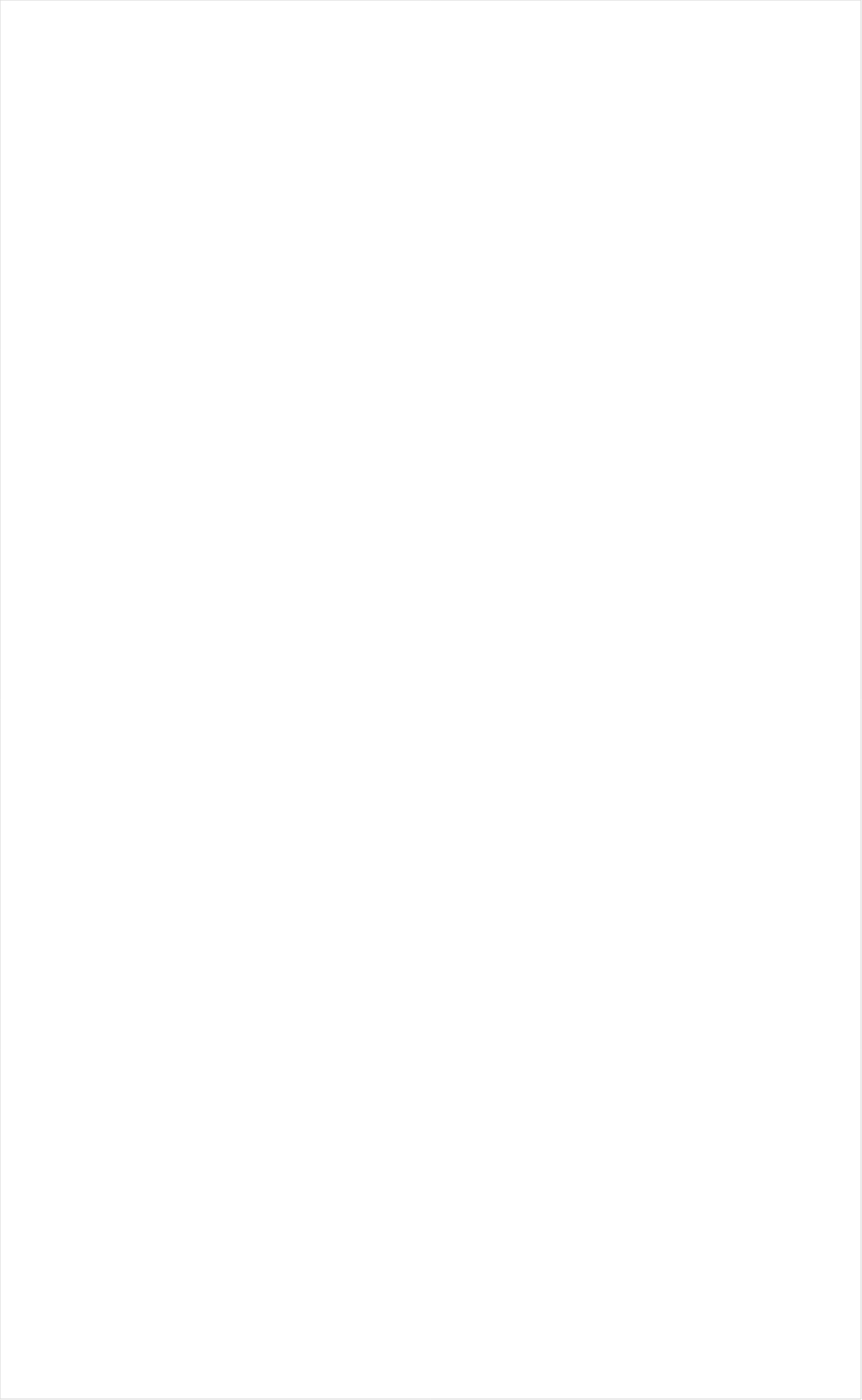
| Category | Total |
|---|---|
| PAC-12 Network | -0.396 |
| RFD TV | -0.291 |
| MyNetworkTV | -0.195 |
| Fox Business | -0.189 |
| Hallmark Movies & Mysteries | -0.188 |
| PBS | -0.183 |
| INSP | -0.171 |
| Smithsonian | -0.165 |
| Tennis Channel | -0.152 |
| MSNBC | -0.149 |
| Hallmark | -0.123 |
| Science Channel | -0.118 |
| Fox News | -0.117 |
| CBS | -0.114 |
| CBS Sports | -0.113 |
| Bloomberg HD | -0.111 |
| History Channel | -0.105 |
| Outdoor Channel | -0.102 |
| Reelz Channel | -0.101 |
| American Heroes Channel | -0.1 |
| DIY | -0.095 |
| Destination America | -0.095 |
| FXDEP | -0.093 |
| National Geographic Wild | -0.093 |
| BBC America | -0.093 |
| Weather Channel | -0.088 |
| CW | -0.085 |
| Olympic Channel | -0.083 |
| SundanceTV | -0.083 |
| ABC | -0.082 |
| FYI | -0.076 |
| NBC | -0.076 |
| HGTV | -0.072 |
| Game Show | -0.069 |
| Fox Sports 1 | -0.069 |
| TV LAND | -0.067 |
| Great American Country | -0.066 |
| Motor Trend Network | -0.066 |
| Cooking Channel | -0.064 |
| Animal Planet | -0.06 |
| National Geographic | -0.059 |
| UP TV | -0.058 |
| ION | -0.058 |
| NHL | -0.057 |
| WGN America | -0.055 |
| NBC Sports | -0.054 |
| Headline News | -0.053 |
| Big Ten Network | -0.053 |
| CNN | -0.053 |
| Travel | -0.049 |
| Oprah Winfrey Network | -0.04 |
| Ovation | -0.04 |
| OXYGEN | -0.037 |
| Investigation Discovery | -0.036 |
| Golf | -0.036 |
| Discovery Channel | -0.034 |
| Discovery Life Channel | -0.032 |
| FOX | -0.027 |
| CMTV | -0.025 |
| AMC | -0.02 |
| POP | -0.018 |
| Discovery Family Channel | -0.014 |
| Food Network | -0.014 |
| ESPNEWS | -0.012 |
| The Sportsman Channel | -0.012 |
| ESPNU | -0.008 |
| Independent Film (IFC) | -0.008 |
| MLB Network | -0.005 |
| WE TV | 0.001 |
| Lifetime | 0.002 |
| FX Movie Channel | 0.006 |
| FOX Sports 2 | 0.007 |
| SYFY | 0.018 |
| NFL Network | 0.018 |
| TBS | 0.02 |
| CNBC | 0.021 |
| BRAVO | 0.023 |
| A&E | 0.024 |
| USA Network | 0.025 |
| TLC | 0.025 |
| TNT | 0.026 |
| Paramount Network | 0.032 |
| ESPN2 | 0.041 |
| E! | 0.042 |
| Viceland | 0.044 |
| TV ONE | 0.044 |
| BET Her | 0.047 |
| Lifetime Movies | 0.049 |
| ESPN Deportes | 0.052 |
| ESPN | 0.057 |
| FX | 0.06 |
| Logo | 0.062 |
| NBA TV | 0.08 |
| Cartoon Network | 0.085 |
| Disney XD | 0.086 |
| Disney Channel | 0.095 |
| FXX | 0.095 |
| Comedy Central | 0.103 |
| Teen Nick | 0.103 |
| truTV | 0.111 |
| Nick@Nite | 0.123 |
| BET | 0.125 |
| MTV2 | 0.136 |
| Freeform | 0.14 |
| NBC Universo | 0.17 |
| VH1 | 0.172 |
| Universal Kids | 0.176 |
| Nick Toons | 0.186 |
| MTV | 0.2 |
| Nick | 0.202 |
| TUDN | 0.209 |
| Adult Swim | 0.213 |
| Galavision | 0.218 |
| Univision | 0.224 |
| Telemundo | 0.254 |
| UniMas | 0.26 |
| Nick Jr. | 0.302 |
| Disney Junior US | 0.318 |